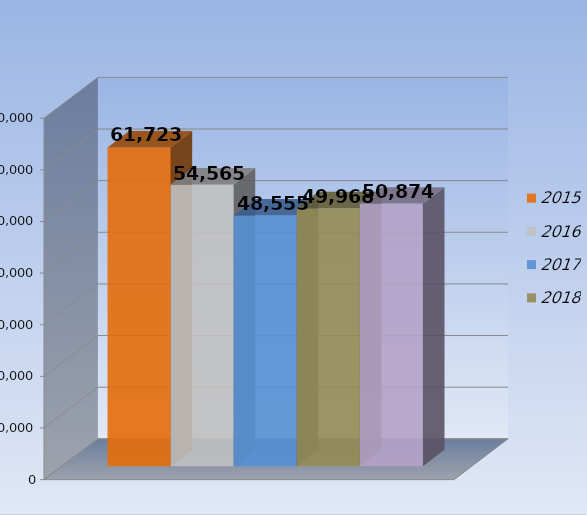
| Category | 2015 | 2016 | 2017 | 2018 | 2019 |
|---|---|---|---|---|---|
| 0 | 61723 | 54565 | 48555 | 49968 | 50874 |